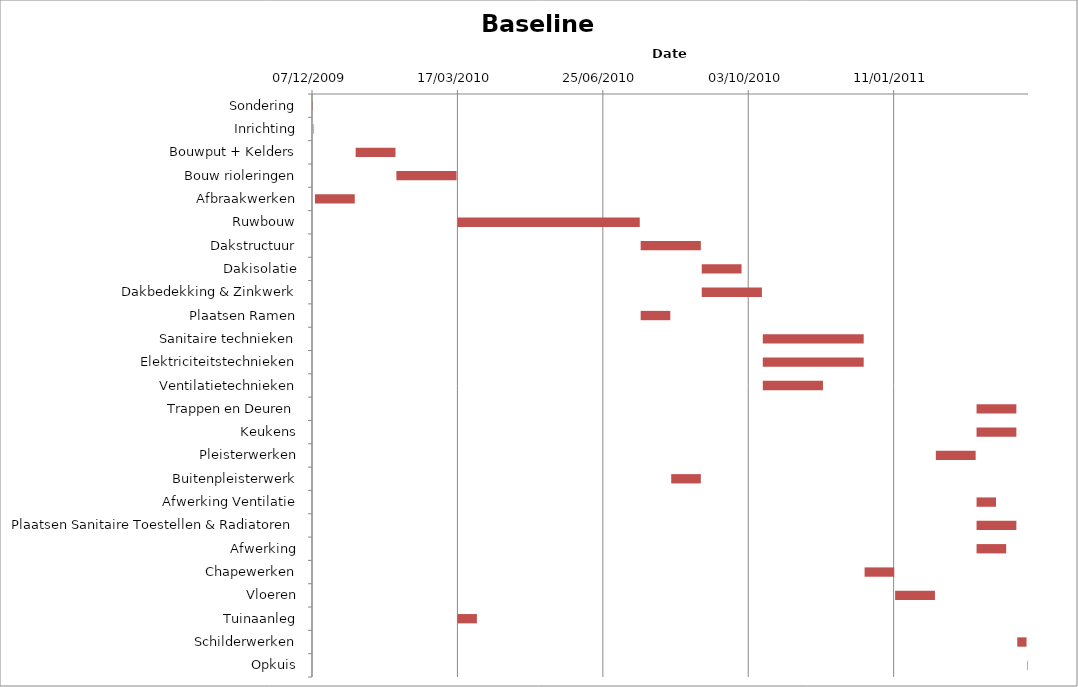
| Category | Baseline start | Actual duration |
|---|---|---|
| Sondering | 40154.333 | 0.375 |
| Inrichting | 40155.333 | 0.375 |
| Bouwput + Kelders | 40184.333 | 27.375 |
| Bouw rioleringen | 40212.333 | 41.375 |
| Afbraakwerken | 40156.333 | 27.375 |
| Ruwbouw | 40254.333 | 125.375 |
| Dakstructuur | 40380.333 | 41.375 |
| Dakisolatie | 40422.333 | 27.375 |
| Dakbedekking & Zinkwerk | 40422.333 | 41.375 |
| Plaatsen Ramen | 40380.333 | 20.375 |
| Sanitaire technieken | 40464.333 | 69.375 |
| Elektriciteitstechnieken | 40464.333 | 69.375 |
| Ventilatietechnieken | 40464.333 | 41.375 |
| Trappen en Deuren | 40611.333 | 27.375 |
| Keukens | 40611.333 | 27.375 |
| Pleisterwerken | 40583.333 | 27.375 |
| Buitenpleisterwerk | 40401.333 | 20.375 |
| Afwerking Ventilatie | 40611.333 | 13.375 |
| Plaatsen Sanitaire Toestellen & Radiatoren | 40611.333 | 27.375 |
| Afwerking | 40611.333 | 20.375 |
| Chapewerken | 40534.333 | 20.375 |
| Vloeren | 40555.333 | 27.375 |
| Tuinaanleg | 40254.333 | 13.375 |
| Schilderwerken | 40639.333 | 6.375 |
| Opkuis | 40646.333 | 0.375 |